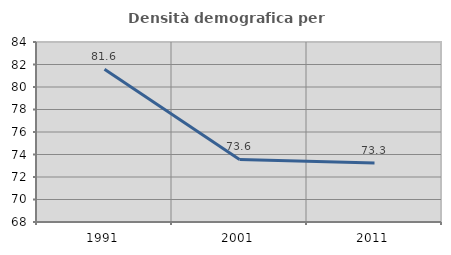
| Category | Densità demografica |
|---|---|
| 1991.0 | 81.581 |
| 2001.0 | 73.564 |
| 2011.0 | 73.255 |